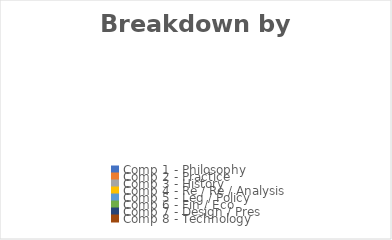
| Category | Breakdown by Competence |
|---|---|
| Comp 1 - Philosophy | 0 |
| Comp 2 - Practice | 0 |
| Comp 3 - History | 0 |
| Comp 4 - Re / Re / Analysis | 0 |
| Comp 5 - Leg / Policy | 0 |
| Comp 6 - Fin / Eco | 0 |
| Comp 7 - Design / Pres | 0 |
| Comp 8 - Technology | 0 |